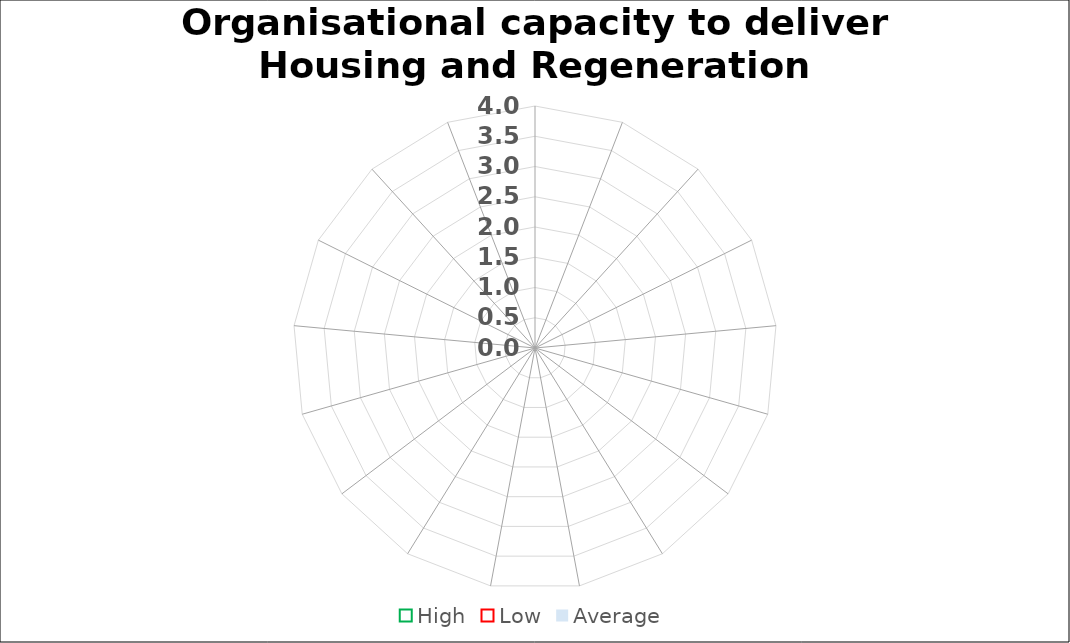
| Category | High | Low | Average |
|---|---|---|---|
|  | 0 | 0 | 0 |
|  | 0 | 0 | 0 |
|  | 0 | 0 | 0 |
|  | 0 | 0 | 0 |
|  | 0 | 0 | 0 |
|  | 0 | 0 | 0 |
|  | 0 | 0 | 0 |
|  | 0 | 0 | 0 |
|  | 0 | 0 | 0 |
|  | 0 | 0 | 0 |
|  | 0 | 0 | 0 |
|  | 0 | 0 | 0 |
|  | 0 | 0 | 0 |
|  | 0 | 0 | 0 |
|  | 0 | 0 | 0 |
|  | 0 | 0 | 0 |
|  | 0 | 0 | 0 |